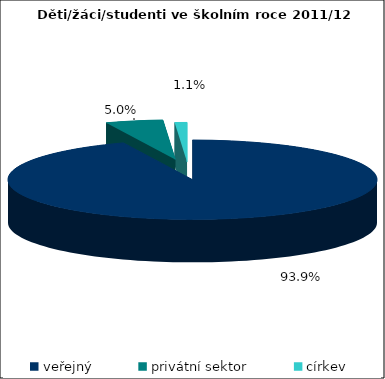
| Category | 2011/12 |
|---|---|
| veřejný | 1569033 |
| privátní sektor | 84289 |
| církev | 17953 |